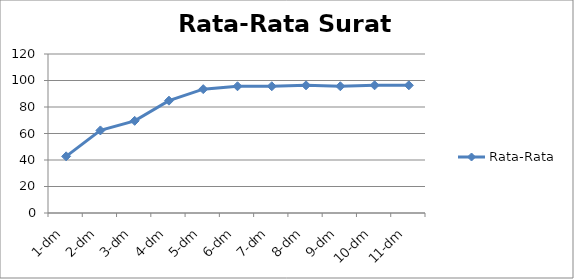
| Category | Rata-Rata |
|---|---|
| 1-dm | 42.754 |
| 2-dm | 62.319 |
| 3-dm | 69.565 |
| 4-dm | 84.783 |
| 5-dm | 93.478 |
| 6-dm | 95.652 |
| 7-dm | 95.652 |
| 8-dm | 96.377 |
| 9-dm | 95.652 |
| 10-dm | 96.377 |
| 11-dm | 96.377 |